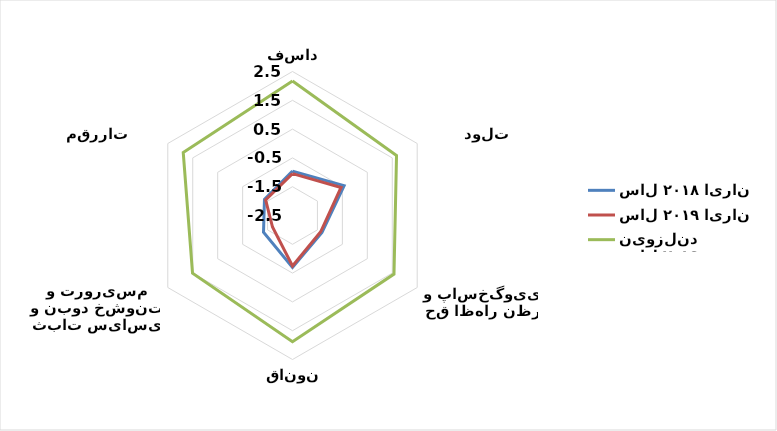
| Category | سال ۲۰۱۸ ایران | سال ۲۰۱۹ ایران | سال ۲۰۱۹ نیوزلند |
|---|---|---|---|
| کنترل فساد | -0.959 | -1.048 | 2.17 |
| اثربخشی دولت | -0.43 | -0.554 | 1.671 |
| حق اظهار نظر و پاسخگویی | -1.318 | -1.37 | 1.569 |
| حاکمیت قانون | -0.694 | -0.749 | 1.885 |
| ثبات سیاسی و نبود خشونت و تروریسم | -1.338 | -1.698 | 1.508 |
| کیفیت مقررات | -1.376 | -1.423 | 1.881 |